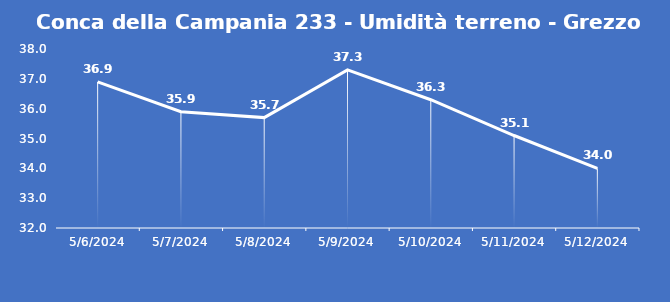
| Category | Conca della Campania 233 - Umidità terreno - Grezzo (%VWC) |
|---|---|
| 5/6/24 | 36.9 |
| 5/7/24 | 35.9 |
| 5/8/24 | 35.7 |
| 5/9/24 | 37.3 |
| 5/10/24 | 36.3 |
| 5/11/24 | 35.1 |
| 5/12/24 | 34 |